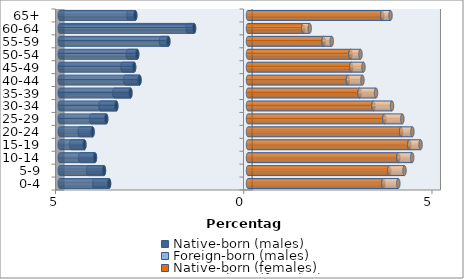
| Category | Native-born (males) | Foreign-born (males) | Native-born (females) | Foreign-born (females) |
|---|---|---|---|---|
| 0-4 | -3.691 | -0.392 | 3.594 | 0.399 |
| 5-9 | -3.826 | -0.418 | 3.75 | 0.407 |
| 10-14 | -4.066 | -0.391 | 3.995 | 0.366 |
| 15-19 | -4.347 | -0.351 | 4.283 | 0.3 |
| 20-24 | -4.129 | -0.341 | 4.068 | 0.298 |
| 25-29 | -3.767 | -0.4 | 3.622 | 0.476 |
| 30-34 | -3.499 | -0.42 | 3.333 | 0.493 |
| 35-39 | -3.123 | -0.43 | 2.963 | 0.437 |
| 40-44 | -2.883 | -0.381 | 2.653 | 0.387 |
| 45-49 | -3.025 | -0.309 | 2.745 | 0.322 |
| 50-54 | -2.944 | -0.248 | 2.724 | 0.264 |
| 55-59 | -2.118 | -0.195 | 2.009 | 0.216 |
| 60-64 | -1.434 | -0.171 | 1.467 | 0.171 |
| 65+ | -2.995 | -0.18 | 3.567 | 0.219 |